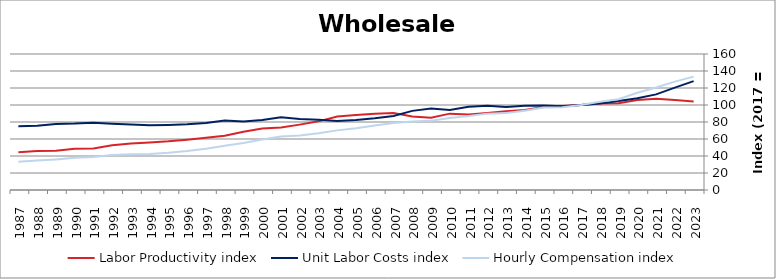
| Category | Labor Productivity index | Unit Labor Costs index | Hourly Compensation index |
|---|---|---|---|
| 2023.0 | 104.15 | 128.072 | 133.387 |
| 2022.0 | 105.891 | 120.397 | 127.489 |
| 2021.0 | 107.225 | 112.473 | 120.6 |
| 2020.0 | 105.891 | 107.973 | 114.334 |
| 2019.0 | 102.071 | 104.6 | 106.766 |
| 2018.0 | 101.892 | 101.899 | 103.827 |
| 2017.0 | 100 | 100 | 100 |
| 2016.0 | 98.762 | 98.543 | 97.323 |
| 2015.0 | 97.644 | 99.369 | 97.028 |
| 2014.0 | 93.99 | 99.147 | 93.188 |
| 2013.0 | 92.601 | 97.762 | 90.529 |
| 2012.0 | 90.544 | 99.235 | 89.851 |
| 2011.0 | 88.894 | 97.81 | 86.947 |
| 2010.0 | 89.84 | 94.14 | 84.576 |
| 2009.0 | 84.944 | 95.956 | 81.509 |
| 2008.0 | 86.555 | 93.098 | 80.581 |
| 2007.0 | 90.557 | 87.081 | 78.858 |
| 2006.0 | 89.85 | 84.506 | 75.928 |
| 2005.0 | 88.288 | 82.428 | 72.774 |
| 2004.0 | 86.382 | 81.203 | 70.144 |
| 2003.0 | 80.757 | 82.679 | 66.769 |
| 2002.0 | 76.915 | 83.487 | 64.215 |
| 2001.0 | 73.506 | 85.487 | 62.838 |
| 2000.0 | 72.373 | 82.235 | 59.516 |
| 1999.0 | 68.618 | 80.655 | 55.343 |
| 1998.0 | 63.741 | 81.786 | 52.131 |
| 1997.0 | 61.468 | 78.8 | 48.437 |
| 1996.0 | 59.214 | 77.334 | 45.793 |
| 1995.0 | 57.229 | 76.57 | 43.82 |
| 1994.0 | 55.743 | 76.204 | 42.478 |
| 1993.0 | 54.659 | 77.183 | 42.187 |
| 1992.0 | 52.768 | 78.085 | 41.204 |
| 1991.0 | 48.935 | 79.11 | 38.712 |
| 1990.0 | 48.501 | 78.164 | 37.91 |
| 1989.0 | 46.297 | 77.777 | 36.008 |
| 1988.0 | 45.776 | 75.529 | 34.574 |
| 1987.0 | 44.354 | 75.011 | 33.27 |